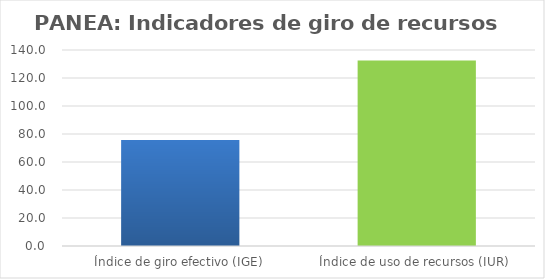
| Category | Series 0 |
|---|---|
| Índice de giro efectivo (IGE) | 75.721 |
| Índice de uso de recursos (IUR)  | 132.555 |